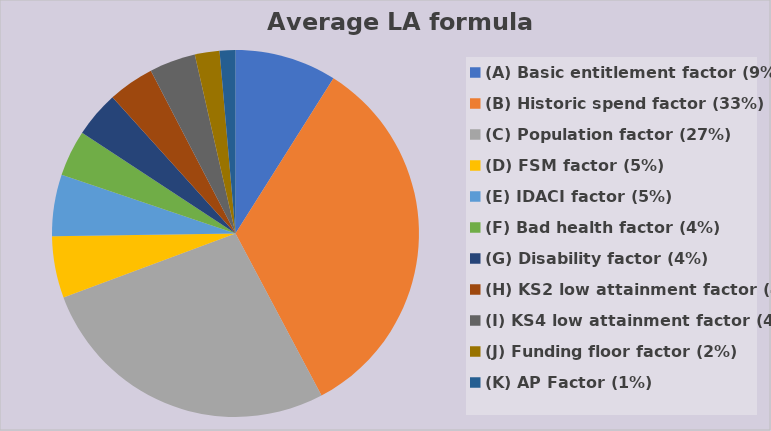
| Category | Series 0 |
|---|---|
| (A) Basic entitlement factor (9%) | 0.09 |
| (B) Historic spend factor (33%) | 0.333 |
| (C) Population factor (27%) | 0.271 |
| (D) FSM factor (5%) | 0.054 |
| (E) IDACI factor (5%) | 0.054 |
| (F) Bad health factor (4%) | 0.041 |
| (G) Disability factor (4%) | 0.041 |
| (H) KS2 low attainment factor (4%) | 0.041 |
| (I) KS4 low attainment factor (4%) | 0.041 |
| (J) Funding floor factor (2%) | 0.022 |
| (K) AP Factor (1%) | 0.014 |